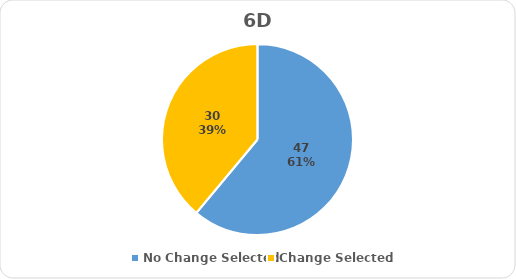
| Category | Series 0 |
|---|---|
| No Change Selected | 47 |
| Change Selected | 30 |